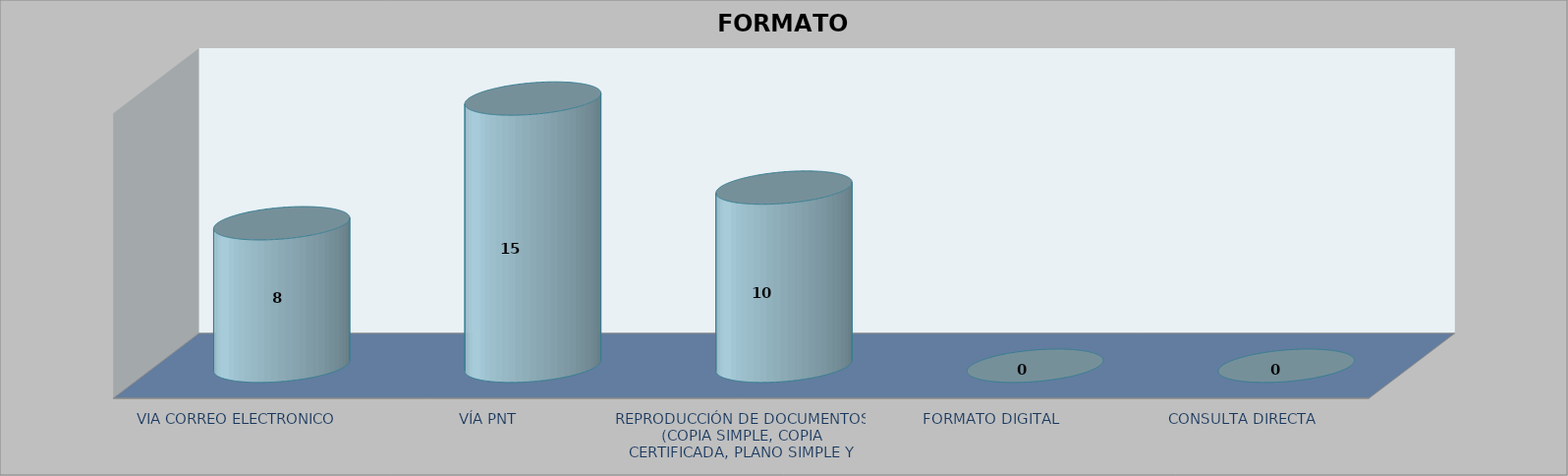
| Category |        FORMATO SOLICITADO | Series 1 | Series 2 |
|---|---|---|---|
| VIA CORREO ELECTRONICO |  |  | 8 |
| VÍA PNT |  |  | 15 |
| REPRODUCCIÓN DE DOCUMENTOS (COPIA SIMPLE, COPIA CERTIFICADA, PLANO SIMPLE Y PLANO CERTIFICADO) |  |  | 10 |
| FORMATO DIGITAL |  |  | 0 |
| CONSULTA DIRECTA |  |  | 0 |